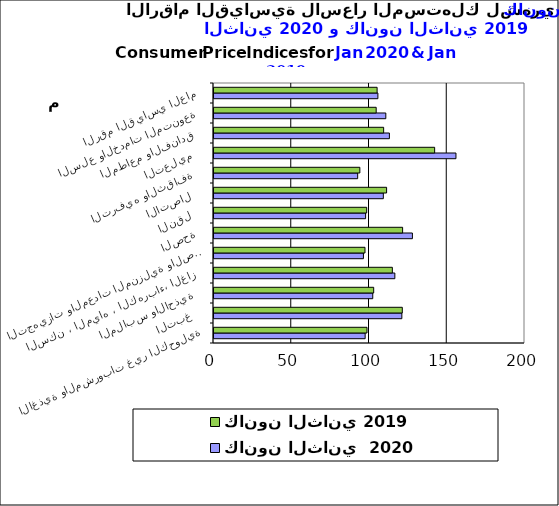
| Category | كانون الثاني  2020      | كانون الثاني 2019 |
|---|---|---|
| الاغذية والمشروبات غير الكحولية | 97.2 | 98.4 |
|  التبغ | 120.8 | 121.1 |
| الملابس والاحذية | 102.1 | 102.7 |
| السكن ، المياه ، الكهرباء، الغاز  | 116.3 | 114.7 |
| التجهيزات والمعدات المنزلية والصيانة | 96.1 | 97.1 |
|  الصحة | 127.6 | 121.3 |
| النقل | 97.5 | 98.2 |
| الاتصال | 108.9 | 111 |
| الترفيه والثقافة | 92.4 | 93.8 |
| التعليم | 155.6 | 141.9 |
| المطاعم والفنادق | 112.8 | 109.1 |
|  السلع والخدمات المتنوعة | 110.5 | 104.3 |
| الرقم القياسي العام | 105.4 | 104.9 |